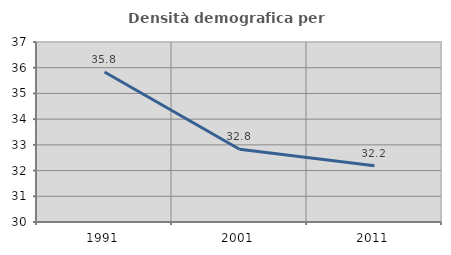
| Category | Densità demografica |
|---|---|
| 1991.0 | 35.836 |
| 2001.0 | 32.832 |
| 2011.0 | 32.188 |